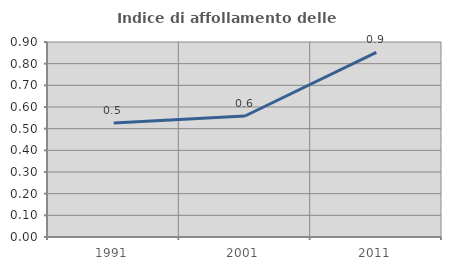
| Category | Indice di affollamento delle abitazioni  |
|---|---|
| 1991.0 | 0.527 |
| 2001.0 | 0.559 |
| 2011.0 | 0.852 |